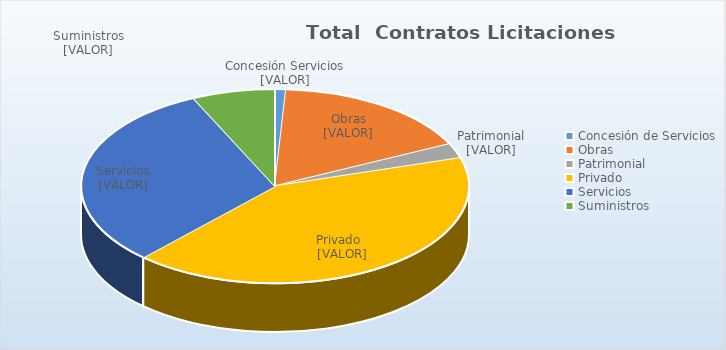
| Category | Total |
|---|---|
| Concesión de Servicios | 420771.33 |
| Obras | 7785299.05 |
| Patrimonial | 1145273.79 |
| Privado | 19100000 |
| Servicios | 14352618.08 |
| Suministros | 3175736.9 |